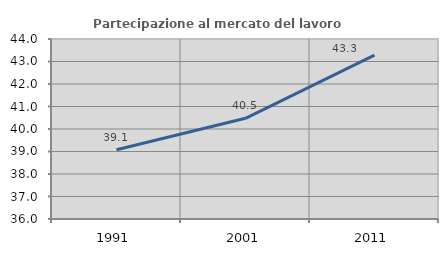
| Category | Partecipazione al mercato del lavoro  femminile |
|---|---|
| 1991.0 | 39.077 |
| 2001.0 | 40.475 |
| 2011.0 | 43.28 |